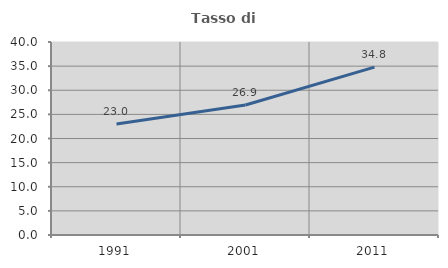
| Category | Tasso di occupazione   |
|---|---|
| 1991.0 | 22.995 |
| 2001.0 | 26.946 |
| 2011.0 | 34.783 |